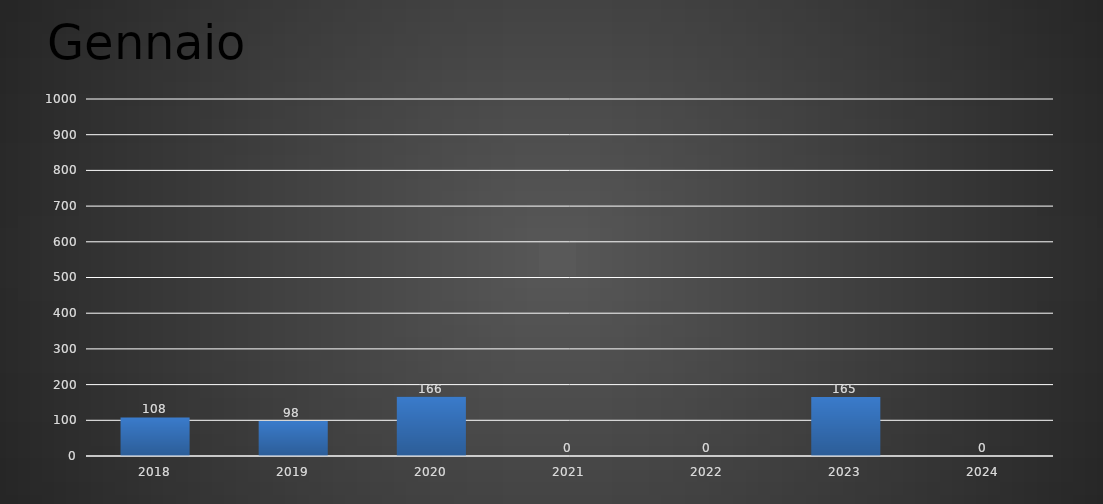
| Category | Gennaio |
|---|---|
| 2018.0 | 108 |
| 2019.0 | 98 |
| 2020.0 | 166 |
| 2021.0 | 0 |
| 2022.0 | 0 |
| 2023.0 | 165 |
| 2024.0 | 0 |